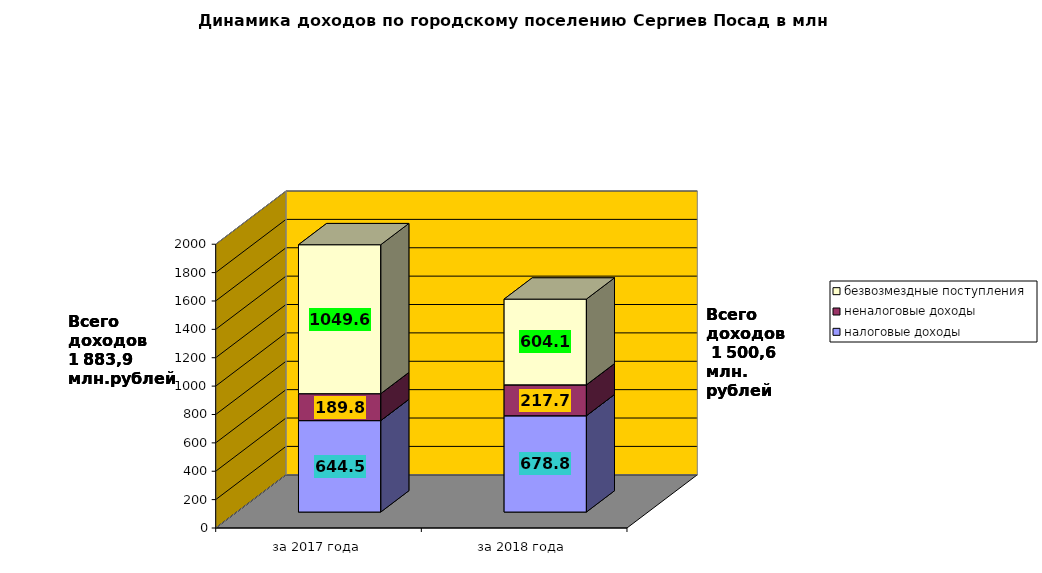
| Category | налоговые доходы | неналоговые доходы | безвозмездные поступления |
|---|---|---|---|
| за 2017 года | 644.5 | 189.8 | 1049.6 |
| за 2018 года | 678.8 | 217.7 | 604.1 |